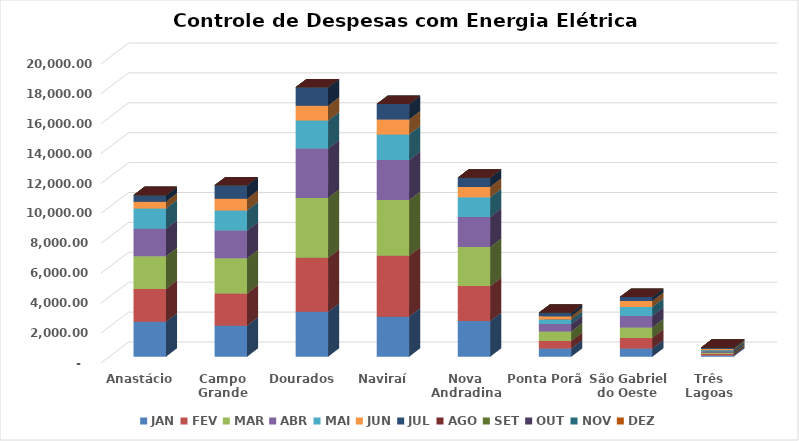
| Category | JAN | FEV | MAR | ABR | MAI | JUN | JUL | AGO | SET | OUT | NOV | DEZ |
|---|---|---|---|---|---|---|---|---|---|---|---|---|
| Anastácio | 2340.9 | 2191.74 | 2178.97 | 1854.43 | 1347.35 | 453.93 | 439.78 | 0 | 0 | 0 | 0 | 0 |
| Campo Grande | 2078.47 | 2150.21 | 2354.92 | 1862.75 | 1334.15 | 780.39 | 899.61 | 0 | 0 | 0 | 0 | 0 |
| Dourados | 3000.91 | 3613.24 | 4001.56 | 3306.1 | 1871.34 | 990.72 | 1235.9 | 0 | 0 | 0 | 0 | 0 |
| Naviraí | 2678.56 | 4069.46 | 3727.68 | 2687.84 | 1706.14 | 997.55 | 1030.83 | 0 | 0 | 0 | 0 | 0 |
| Nova Andradina | 2379.84 | 2346.16 | 2613.42 | 2003.92 | 1316.54 | 696.2 | 614.5 | 0 | 0 | 0 | 0 | 0 |
| Ponta Porã | 544.59 | 506.94 | 636.73 | 493.88 | 298.91 | 222.7 | 230.86 | 0 | 0 | 0 | 0 | 0 |
| São Gabriel do Oeste | 546.9 | 710.05 | 699.32 | 771.95 | 596.92 | 402.83 | 258.3 | 0 | 0 | 0 | 0 | 0 |
| Três Lagoas | 86.81 | 87.22 | 88.96 | 87.41 | 85.12 | 85.16 | 84.41 | 0 | 0 | 0 | 0 | 0 |